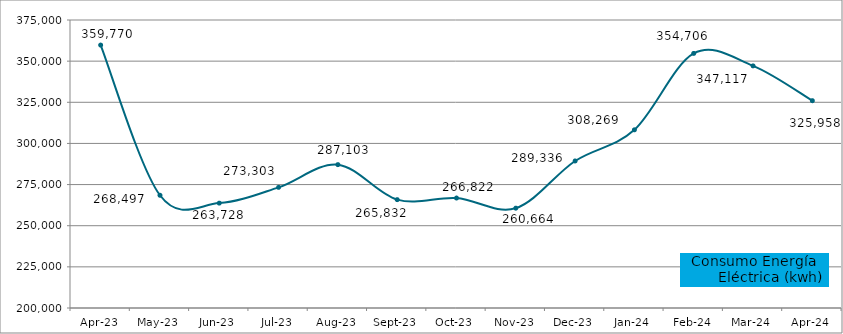
| Category | abr-23 |
|---|---|
| 2023-04-01 | 359770.072 |
| 2023-05-01 | 268496.726 |
| 2023-06-01 | 263727.965 |
| 2023-07-01 | 273303.375 |
| 2023-08-01 | 287103.118 |
| 2023-09-01 | 265832.469 |
| 2023-10-01 | 266821.706 |
| 2023-11-01 | 260663.832 |
| 2023-12-01 | 289336.014 |
| 2024-01-01 | 308268.602 |
| 2024-02-01 | 354705.523 |
| 2024-03-01 | 347117.352 |
| 2024-04-01 | 325957.944 |